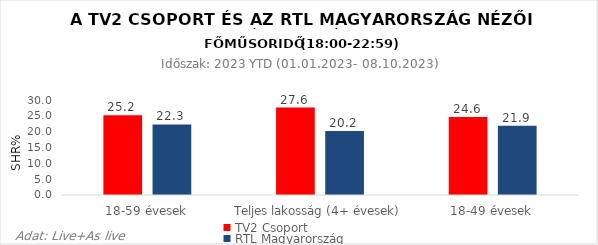
| Category | TV2 Csoport | RTL Magyarország |
|---|---|---|
| 18-59 évesek | 25.2 | 22.3 |
| Teljes lakosság (4+ évesek) | 27.6 | 20.2 |
| 18-49 évesek | 24.6 | 21.9 |